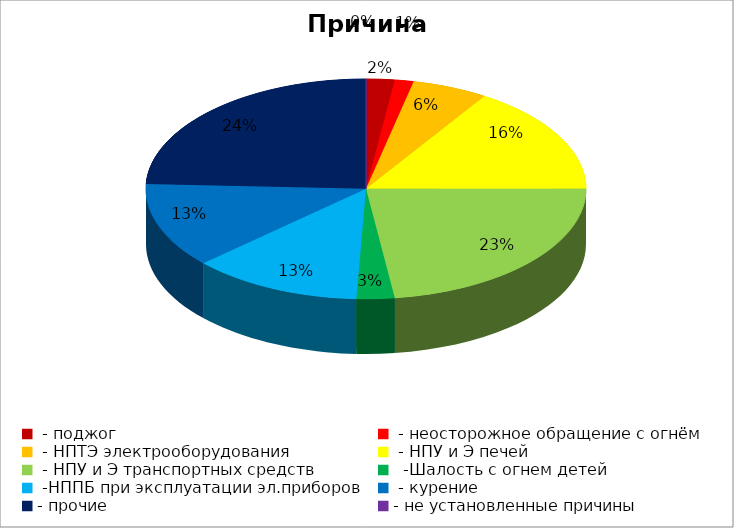
| Category | Причина пожара |
|---|---|
|  - поджог | 3 |
|  - неосторожное обращение с огнём | 2 |
|  - НПТЭ электрооборудования | 8 |
|  - НПУ и Э печей | 23 |
|  - НПУ и Э транспортных средств | 33 |
|   -Шалость с огнем детей | 4 |
|  -НППБ при эксплуатации эл.приборов | 18 |
|  - курение | 18 |
| - прочие | 35 |
| - не установленные причины | 0 |